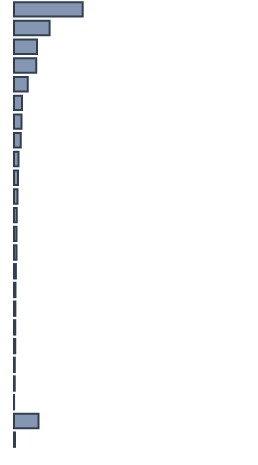
| Category | Percentatge |
|---|---|
| 0 | 28.622 |
| 1 | 14.837 |
| 2 | 9.575 |
| 3 | 9.305 |
| 4 | 5.747 |
| 5 | 3.381 |
| 6 | 3.083 |
| 7 | 2.795 |
| 8 | 1.912 |
| 9 | 1.716 |
| 10 | 1.447 |
| 11 | 1.153 |
| 12 | 1.063 |
| 13 | 1.009 |
| 14 | 0.786 |
| 15 | 0.613 |
| 16 | 0.569 |
| 17 | 0.522 |
| 18 | 0.517 |
| 19 | 0.334 |
| 20 | 0.307 |
| 21 | 0.032 |
| 22 | 10.26 |
| 23 | 0.414 |